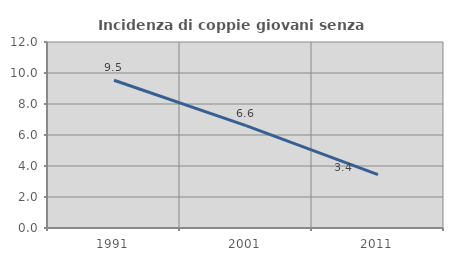
| Category | Incidenza di coppie giovani senza figli |
|---|---|
| 1991.0 | 9.531 |
| 2001.0 | 6.604 |
| 2011.0 | 3.448 |